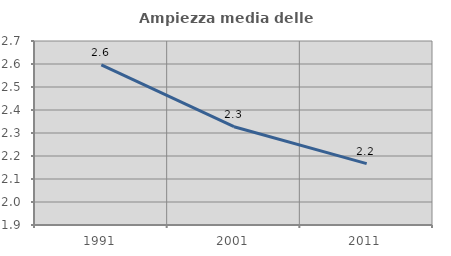
| Category | Ampiezza media delle famiglie |
|---|---|
| 1991.0 | 2.596 |
| 2001.0 | 2.327 |
| 2011.0 | 2.167 |